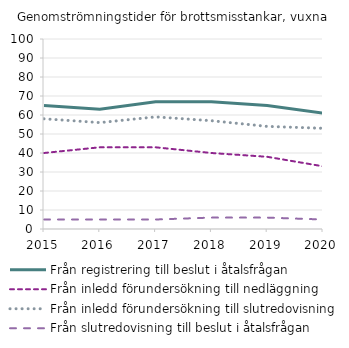
| Category | Från registrering till beslut i åtalsfrågan | Från inledd förundersökning till nedläggning | Från inledd förundersökning till slutredovisning | Från slutredovisning till beslut i åtalsfrågan |
|---|---|---|---|---|
| 2015 | 65 | 40 | 58 | 5 |
| 2016 | 63 | 43 | 56 | 5 |
| 2017 | 67 | 43 | 59 | 5 |
| 2018 | 67 | 40 | 57 | 6 |
| 2019 | 65 | 38 | 54 | 6 |
| 2020 | 61 | 33 | 53 | 5 |